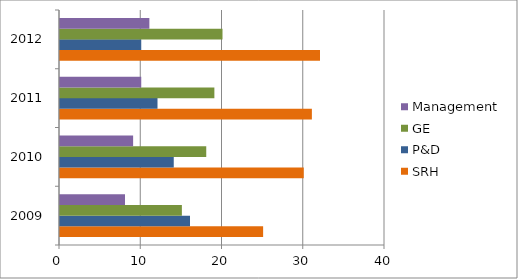
| Category | SRH | P&D | GE | Management |
|---|---|---|---|---|
| 2009.0 | 25 | 16 | 15 | 8 |
| 2010.0 | 30 | 14 | 18 | 9 |
| 2011.0 | 31 | 12 | 19 | 10 |
| 2012.0 | 32 | 10 | 20 | 11 |